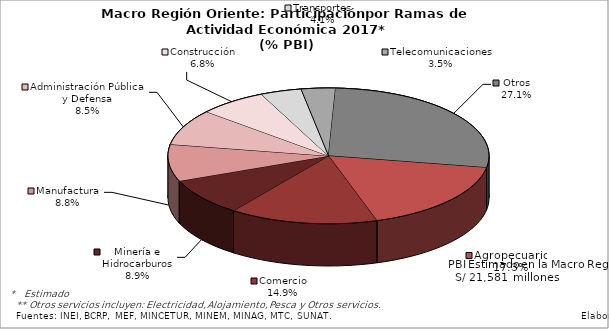
| Category | Series 0 |
|---|---|
| Agropecuario | 3744.279 |
| Comercio | 3225.345 |
| Minería e Hidrocarburos | 1922.941 |
| Manufactura | 1889.041 |
| Administración Pública y Defensa | 1842.9 |
| Construcción | 1477.82 |
| Transportes | 891.287 |
| Telecomunicaciones | 745.205 |
| Otros | 5842.362 |